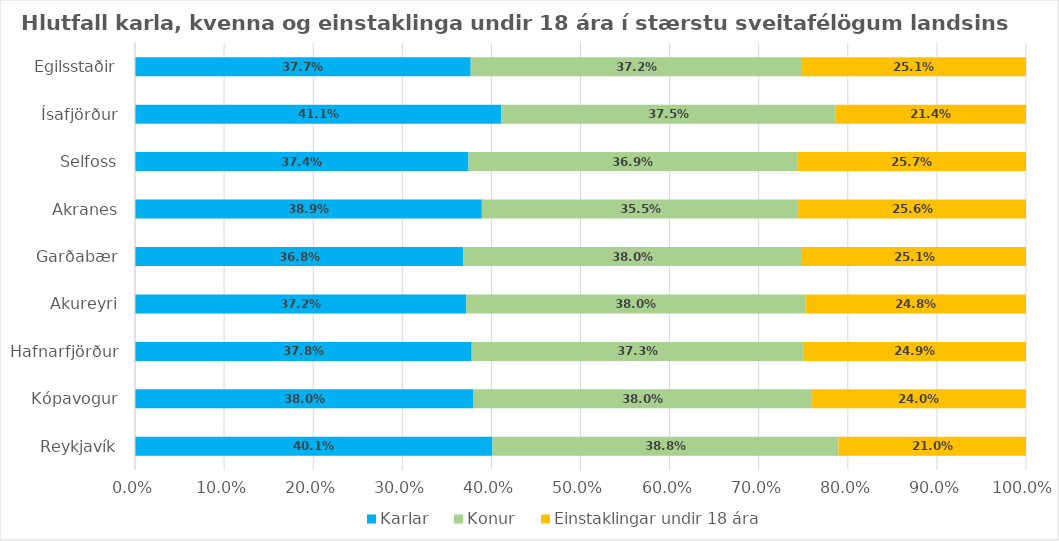
| Category | Karlar | Konur | Einstaklingar undir 18 ára |
|---|---|---|---|
| Reykjavík | 0.401 | 0.388 | 0.21 |
| Kópavogur | 0.38 | 0.38 | 0.24 |
| Hafnarfjörður | 0.378 | 0.373 | 0.249 |
| Akureyri | 0.372 | 0.38 | 0.248 |
| Garðabær | 0.368 | 0.38 | 0.251 |
| Akranes | 0.389 | 0.355 | 0.256 |
| Selfoss | 0.374 | 0.369 | 0.257 |
| Ísafjörður | 0.411 | 0.375 | 0.214 |
| Egilsstaðir | 0.377 | 0.372 | 0.251 |